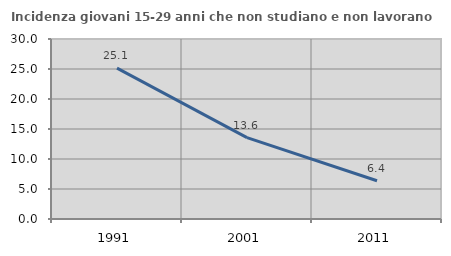
| Category | Incidenza giovani 15-29 anni che non studiano e non lavorano  |
|---|---|
| 1991.0 | 25.15 |
| 2001.0 | 13.559 |
| 2011.0 | 6.383 |